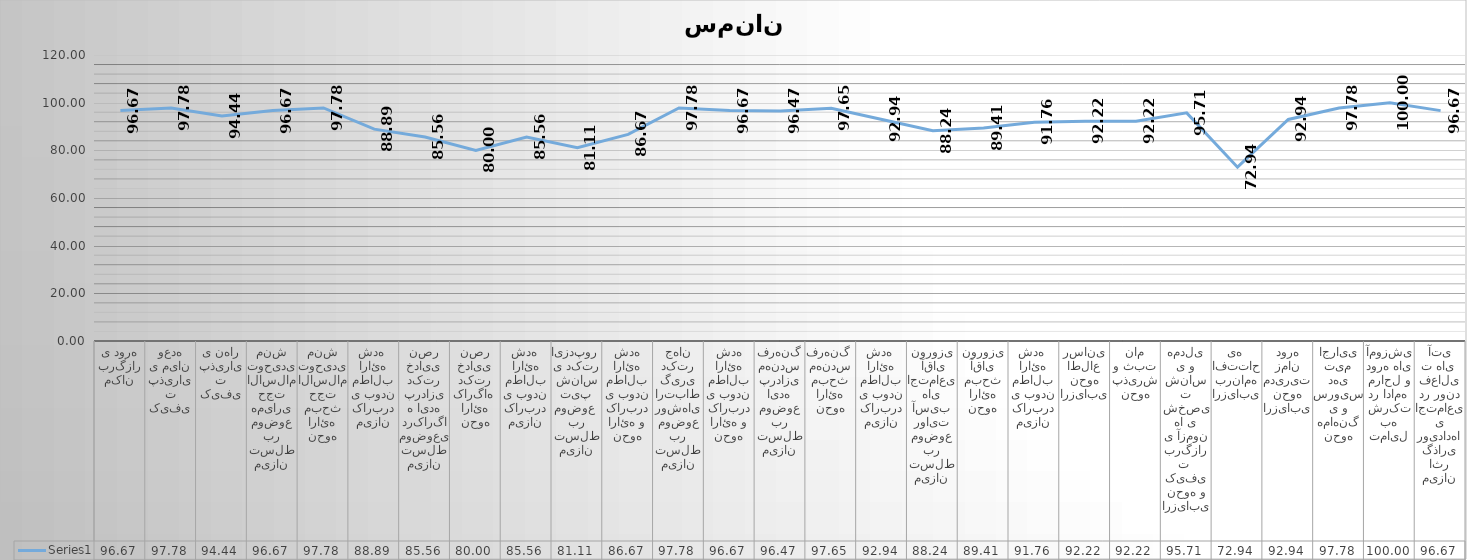
| Category | Series 0 |
|---|---|
| مکان برگزاری دوره | 96.667 |
| کیفیت پذیرایی میان وعده | 97.778 |
| کیفیت پذیرایی نهار | 94.444 |
| میزان تسلط بر موضوع همیاری حجت الاسلام توحیدی منش | 96.667 |
| نحوه ارائه مبحث حجت الاسلام توحیدی منش | 97.778 |
| میزان کاربردی بودن مطالب ارائه شده  | 88.889 |
| میزان تسلط موضوعی درکارگاه ایده پردازی دکتر خدایی نصر | 85.556 |
| نحوه ارائه کارگاه  دکتر خدایی نصر | 80 |
| میزان کاربردی بودن مطالب ارائه شده  | 85.556 |
| میزان تسلط بر موضوع  تیپ شناسی دکتر ایزدپور  | 81.111 |
| نحوه ارائه و کاربردی بودن مطالب ارائه شده | 86.667 |
| میزان تسلط بر موضوع روشهای ارتباط گیری دکتر جهان | 97.778 |
| نحوه ارائه و کاربردی بودن مطالب ارائه شده | 96.667 |
| میزان تسلط بر موضوع ایده پردازی مهندس فرهنگ | 96.471 |
| نحوه ارائه مبحث مهندس فرهنگ  | 97.647 |
| میزان کاربردی بودن مطالب ارائه شده  | 92.941 |
| میزان تسلط بر موضوع روایت آسیب های اجتماعی  آقای نوروزی | 88.235 |
| نحوه ارائه مبحث آقای نوروزی | 89.412 |
| میزان کاربردی بودن مطالب ارائه شده  | 91.765 |
| ارزیابی نحوه اطلاع رسانی | 92.222 |
| نحوه پذیرش و ثبت نام | 92.222 |
| ارزیابی نحوه و کیفیت  برگزاری آزمون ها ی شخصیت شناسی و همدلی | 95.714 |
| ارزیابی برنامه افتتاحیه  | 72.941 |
| ارزیابی نحوه مدیریت زمان دوره | 92.941 |
| نحوه هماهنگی و سرویس دهی تیم اجرایی | 97.778 |
| تمایل به شرکت در ادامه مراحل و دوره های آموزشی | 100 |
| میزان اثر گذاری رویدادهای اجتماعی در روند فعالیت های  آتی | 96.667 |